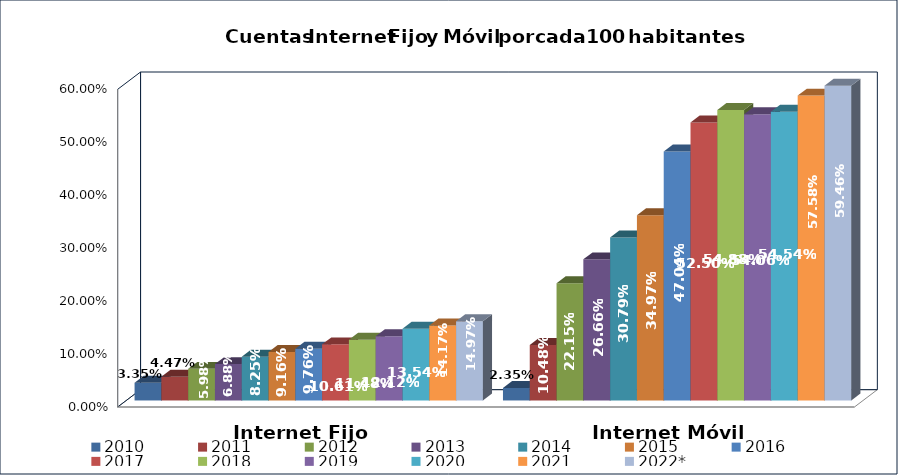
| Category | 2010 | 2011 | 2012 | 2013 | 2014 | 2015 | 2016 | 2017 | 2018 | 2019 | 2020 | 2021 | 2022* |
|---|---|---|---|---|---|---|---|---|---|---|---|---|---|
| Internet Fijo | 0.033 | 0.045 | 0.06 | 0.069 | 0.083 | 0.092 | 0.098 | 0.106 | 0.115 | 0.121 | 0.135 | 0.142 | 0.15 |
| Internet Móvil | 0.024 | 0.105 | 0.222 | 0.267 | 0.308 | 0.35 | 0.47 | 0.525 | 0.549 | 0.541 | 0.545 | 0.576 | 0.595 |